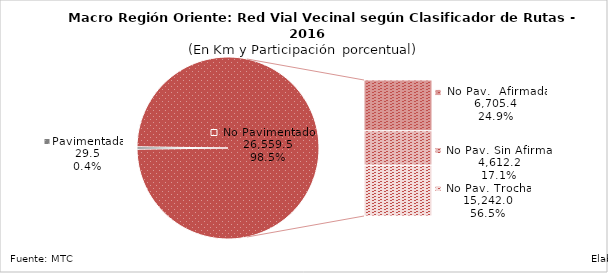
| Category | Series 0 |
|---|---|
| Pavimentada | 29.51 |
| No Pavimentada                   Afirmada | 2600.79 |
| No Pavimentada                   Sin Afirmar | 1763.245 |
| No Pavimentada                            Trocha | 2599.193 |